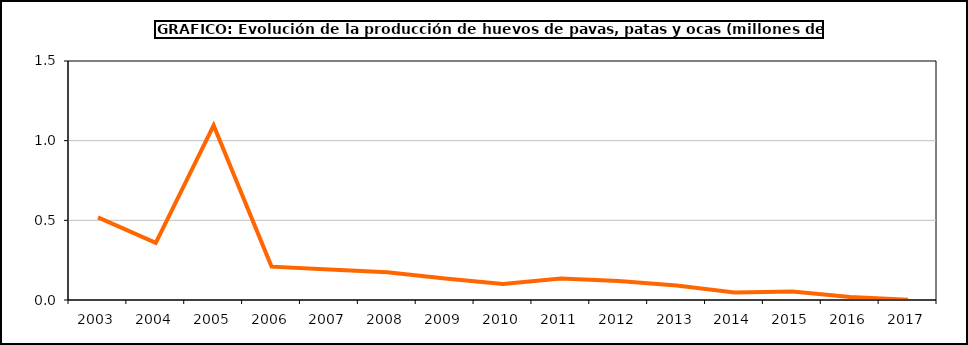
| Category | huevos |
|---|---|
| 2003.0 | 0.519 |
| 2004.0 | 0.358 |
| 2005.0 | 1.095 |
| 2006.0 | 0.209 |
| 2007.0 | 0.191 |
| 2008.0 | 0.174 |
| 2009.0 | 0.135 |
| 2010.0 | 0.1 |
| 2011.0 | 0.135 |
| 2012.0 | 0.119 |
| 2013.0 | 0.09 |
| 2014.0 | 0.047 |
| 2015.0 | 0.054 |
| 2016.0 | 0.019 |
| 2017.0 | 0.002 |